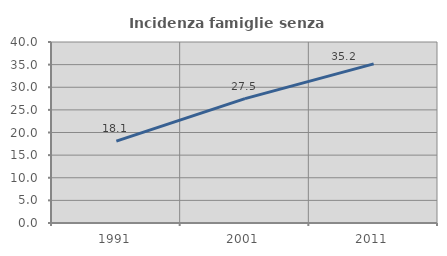
| Category | Incidenza famiglie senza nuclei |
|---|---|
| 1991.0 | 18.095 |
| 2001.0 | 27.492 |
| 2011.0 | 35.165 |